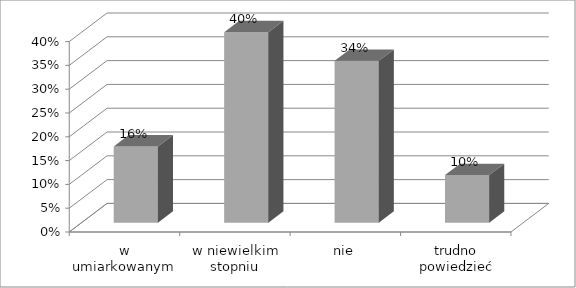
| Category | Series 0 |
|---|---|
| w umiarkowanym stopniu | 0.16 |
| w niewielkim stopniu | 0.4 |
| nie | 0.34 |
| trudno powiedzieć | 0.1 |